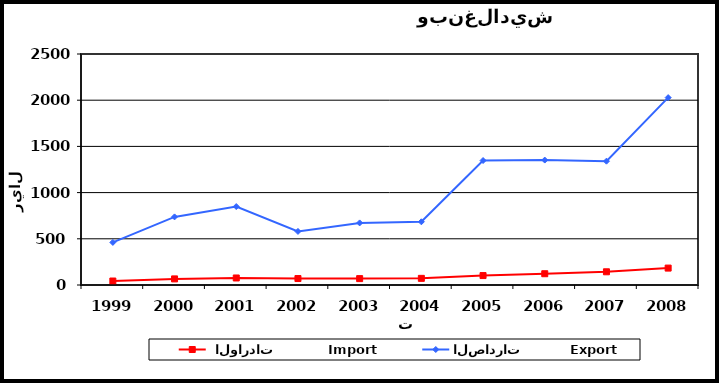
| Category |  الواردات           Import | الصادرات          Export |
|---|---|---|
| 1999.0 | 43 | 461 |
| 2000.0 | 66 | 737 |
| 2001.0 | 76 | 849 |
| 2002.0 | 70 | 580 |
| 2003.0 | 69 | 672 |
| 2004.0 | 72 | 684 |
| 2005.0 | 102 | 1347 |
| 2006.0 | 122 | 1352 |
| 2007.0 | 143 | 1340 |
| 2008.0 | 183 | 2028 |